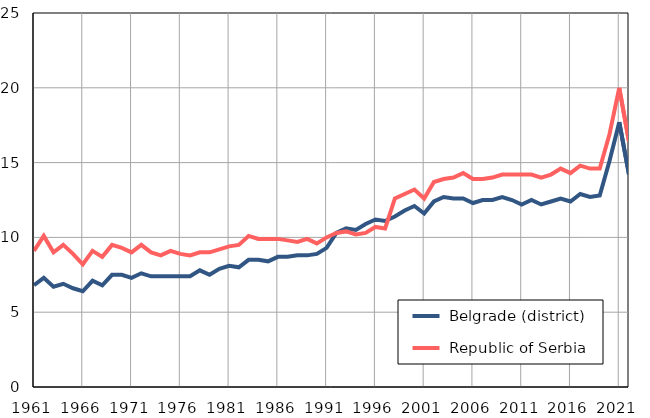
| Category |  Belgrade (district) |  Republic of Serbia |
|---|---|---|
| 1961.0 | 6.8 | 9.1 |
| 1962.0 | 7.3 | 10.1 |
| 1963.0 | 6.7 | 9 |
| 1964.0 | 6.9 | 9.5 |
| 1965.0 | 6.6 | 8.9 |
| 1966.0 | 6.4 | 8.2 |
| 1967.0 | 7.1 | 9.1 |
| 1968.0 | 6.8 | 8.7 |
| 1969.0 | 7.5 | 9.5 |
| 1970.0 | 7.5 | 9.3 |
| 1971.0 | 7.3 | 9 |
| 1972.0 | 7.6 | 9.5 |
| 1973.0 | 7.4 | 9 |
| 1974.0 | 7.4 | 8.8 |
| 1975.0 | 7.4 | 9.1 |
| 1976.0 | 7.4 | 8.9 |
| 1977.0 | 7.4 | 8.8 |
| 1978.0 | 7.8 | 9 |
| 1979.0 | 7.5 | 9 |
| 1980.0 | 7.9 | 9.2 |
| 1981.0 | 8.1 | 9.4 |
| 1982.0 | 8 | 9.5 |
| 1983.0 | 8.5 | 10.1 |
| 1984.0 | 8.5 | 9.9 |
| 1985.0 | 8.4 | 9.9 |
| 1986.0 | 8.7 | 9.9 |
| 1987.0 | 8.7 | 9.8 |
| 1988.0 | 8.8 | 9.7 |
| 1989.0 | 8.8 | 9.9 |
| 1990.0 | 8.9 | 9.6 |
| 1991.0 | 9.3 | 10 |
| 1992.0 | 10.3 | 10.3 |
| 1993.0 | 10.6 | 10.4 |
| 1994.0 | 10.5 | 10.2 |
| 1995.0 | 10.9 | 10.3 |
| 1996.0 | 11.2 | 10.7 |
| 1997.0 | 11.1 | 10.6 |
| 1998.0 | 11.4 | 12.6 |
| 1999.0 | 11.8 | 12.9 |
| 2000.0 | 12.1 | 13.2 |
| 2001.0 | 11.6 | 12.6 |
| 2002.0 | 12.4 | 13.7 |
| 2003.0 | 12.7 | 13.9 |
| 2004.0 | 12.6 | 14 |
| 2005.0 | 12.6 | 14.3 |
| 2006.0 | 12.3 | 13.9 |
| 2007.0 | 12.5 | 13.9 |
| 2008.0 | 12.5 | 14 |
| 2009.0 | 12.7 | 14.2 |
| 2010.0 | 12.5 | 14.2 |
| 2011.0 | 12.2 | 14.2 |
| 2012.0 | 12.5 | 14.2 |
| 2013.0 | 12.2 | 14 |
| 2014.0 | 12.4 | 14.2 |
| 2015.0 | 12.6 | 14.6 |
| 2016.0 | 12.4 | 14.3 |
| 2017.0 | 12.9 | 14.8 |
| 2018.0 | 12.7 | 14.6 |
| 2019.0 | 12.8 | 14.6 |
| 2020.0 | 15.1 | 16.9 |
| 2021.0 | 17.7 | 20 |
| 2022.0 | 14.2 | 16.4 |